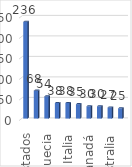
| Category | Series 0 |
|---|---|
| Estados Unidos | 236 |
| Alemania | 68 |
| Suecia | 54 |
| Finlandia | 38 |
| Italia | 38 |
| Reino Unido | 35 |
| Canadá | 30 |
| Francia | 30 |
| Australia | 27 |
| Noruega | 25 |